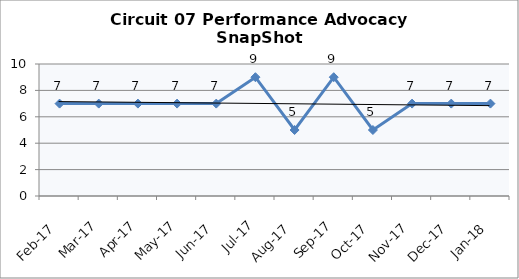
| Category | Circuit 07 |
|---|---|
| Feb-17 | 7 |
| Mar-17 | 7 |
| Apr-17 | 7 |
| May-17 | 7 |
| Jun-17 | 7 |
| Jul-17 | 9 |
| Aug-17 | 5 |
| Sep-17 | 9 |
| Oct-17 | 5 |
| Nov-17 | 7 |
| Dec-17 | 7 |
| Jan-18 | 7 |